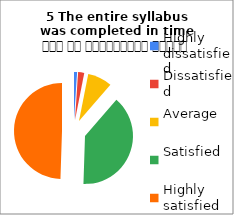
| Category | 5 The entire syllabus
was completed in time समय पर पाठ्यक्रम पूर्ण हुआ |
|---|---|
| Highly dissatisfied | 1 |
| Dissatisfied | 2 |
| Average | 8 |
| Satisfied | 38 |
| Highly satisfied | 48 |